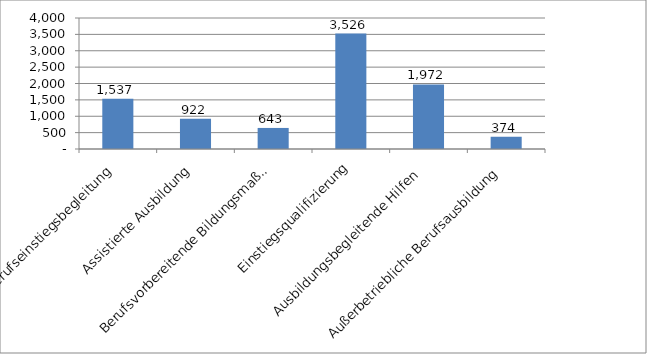
| Category | Series 0 |
|---|---|
| Berufseinstiegsbegleitung | 1537 |
| Assistierte Ausbildung | 922 |
| Berufsvorbereitende Bildungsmaßnahmen | 643 |
| Einstiegsqualifizierung | 3526 |
| Ausbildungsbegleitende Hilfen  | 1972 |
| Außerbetriebliche Berufsausbildung | 374 |